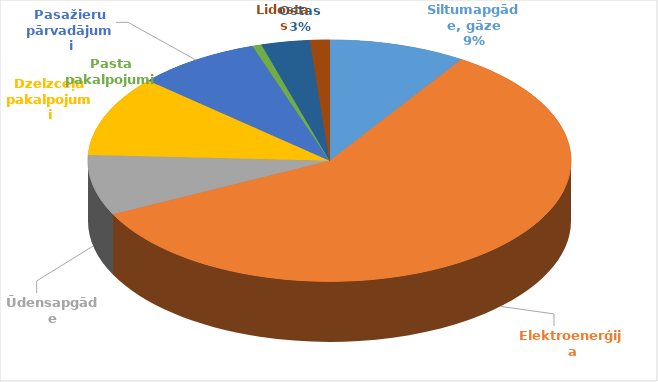
| Category | Series 0 | Series 1 |
|---|---|---|
| Siltumapgāde, gāze | 69673241 | 0.092 |
| Elektroenerģija | 444456538 | 0.585 |
| Ūdensapgāde | 61183938 | 0.081 |
| Dzelzceļu pakalpojumi | 81989872 | 0.108 |
| Pasažieru pārvadājumi | 63039952 | 0.083 |
| Pasta pakalpojumi | 4774592 | 0.006 |
| Ostas | 24576754 | 0.032 |
| Lidostas | 9911998 | 0.013 |